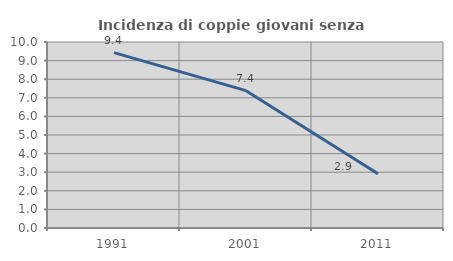
| Category | Incidenza di coppie giovani senza figli |
|---|---|
| 1991.0 | 9.429 |
| 2001.0 | 7.384 |
| 2011.0 | 2.915 |